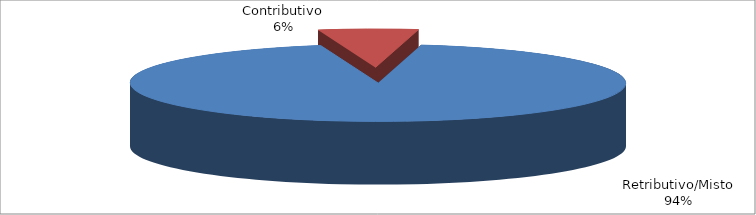
| Category | Decorrenti gennaio - marzo 2023 |
|---|---|
| Retributivo/Misto | 80445 |
| Contributivo | 5586 |